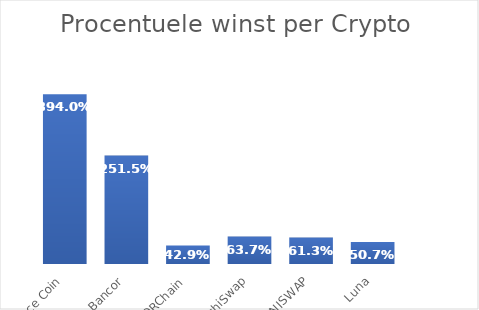
| Category | Series 0 |
|---|---|
| Binance Coin | 3.94 |
| Bancor | 2.515 |
| THORChain | 0.429 |
| SushiSwap | 0.637 |
| UNISWAP | 0.613 |
| Luna | 0.507 |